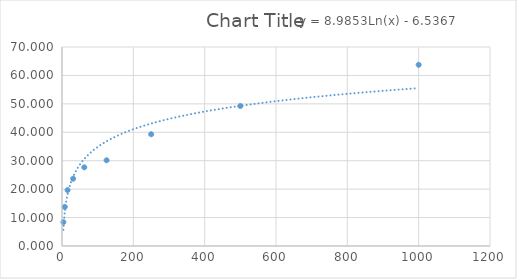
| Category | Series 0 |
|---|---|
| 3.91 | 8.397 |
| 7.81 | 13.74 |
| 15.62 | 19.656 |
| 31.25 | 23.664 |
| 62.5 | 27.672 |
| 125.0 | 30.153 |
| 250.0 | 39.313 |
| 500.0 | 49.237 |
| 1000.0 | 63.74 |